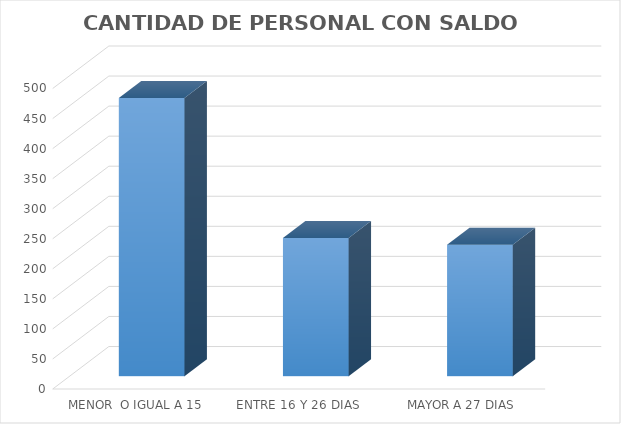
| Category | CANTIDAD DE PERSONAL |
|---|---|
| MENOR  O IGUAL A 15 DIAS | 463 |
| ENTRE 16 Y 26 DIAS | 230 |
| MAYOR A 27 DIAS | 219 |